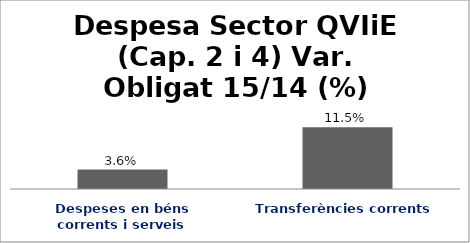
| Category | Series 0 |
|---|---|
| Despeses en béns corrents i serveis | 0.036 |
| Transferències corrents | 0.115 |